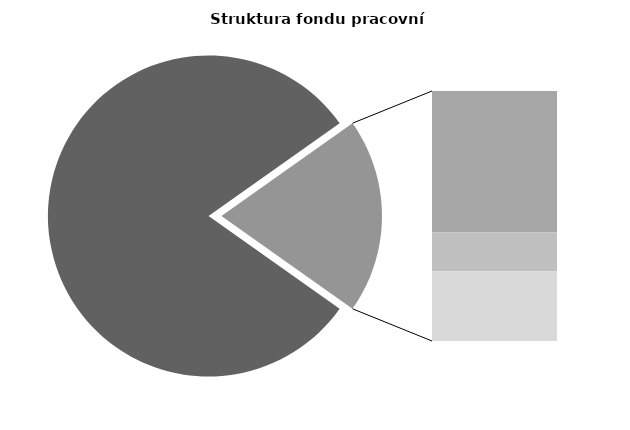
| Category | Series 0 |
|---|---|
| Průměrná měsíční odpracovaná doba bez přesčasu | 138.592 |
| Dovolená | 19.087 |
| Nemoc | 5.279 |
| Jiné | 9.442 |